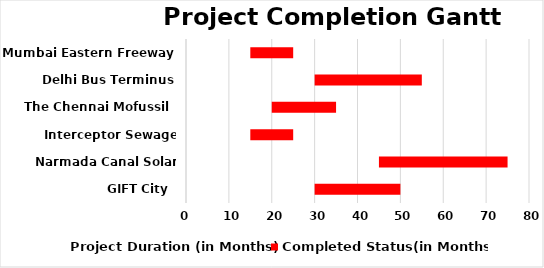
| Category | Project Duration (in Months) | Completed Status(in Months) |
|---|---|---|
| GIFT City  | 30 | 20 |
| Narmada Canal Solar Project | 45 | 30 |
| Interceptor Sewage System | 15 | 10 |
| The Chennai Mofussil  | 20 | 15 |
| Delhi Bus Terminus | 30 | 25 |
| Mumbai Eastern Freeway | 15 | 10 |